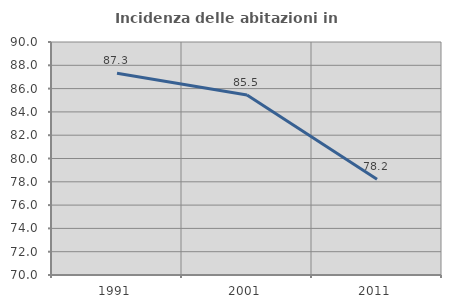
| Category | Incidenza delle abitazioni in proprietà  |
|---|---|
| 1991.0 | 87.323 |
| 2001.0 | 85.452 |
| 2011.0 | 78.221 |